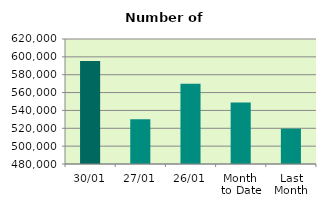
| Category | Series 0 |
|---|---|
| 30/01 | 595340 |
| 27/01 | 530056 |
| 26/01 | 569804 |
| Month 
to Date | 548930.857 |
| Last
Month | 519611.714 |